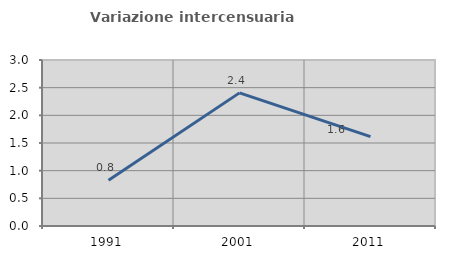
| Category | Variazione intercensuaria annua |
|---|---|
| 1991.0 | 0.827 |
| 2001.0 | 2.406 |
| 2011.0 | 1.616 |